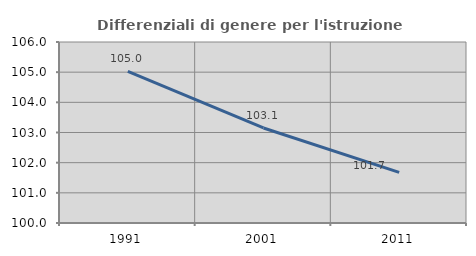
| Category | Differenziali di genere per l'istruzione superiore |
|---|---|
| 1991.0 | 105.03 |
| 2001.0 | 103.15 |
| 2011.0 | 101.68 |